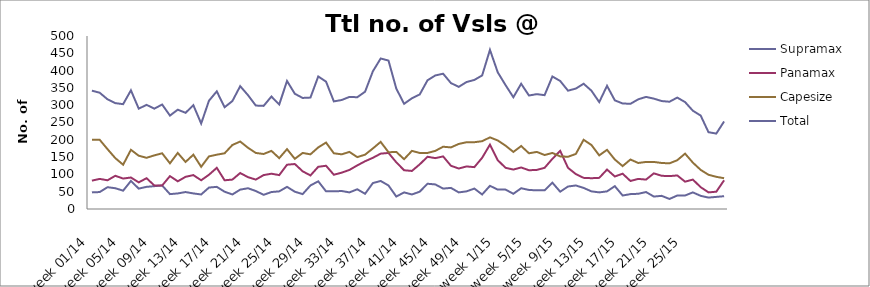
| Category | Supramax | Panamax | Capesize | Total |
|---|---|---|---|---|
| week 01/14 | 48 | 82 | 200 | 342 |
| week 02/14 | 49 | 87 | 200 | 336 |
| week 03/14 | 63 | 83 | 173 | 317 |
| week 04/14 | 60 | 96 | 147 | 306 |
| week 05/14 | 53 | 88 | 128 | 303 |
| week 06/14 | 81 | 91 | 171 | 343 |
| week 07/14 | 59 | 77 | 154 | 290 |
| week 08/14 | 64 | 89 | 148 | 301 |
| week 09/14 | 66 | 68 | 155 | 290 |
| week 10/14 | 68 | 68 | 161 | 302 |
| week 11/14 | 43 | 95 | 132 | 270 |
| week 12/14 | 45 | 80 | 162 | 287 |
| week 13/14 | 49 | 93 | 136 | 278 |
| week 14/14 | 45 | 98 | 157 | 300 |
| week 15/14 | 42 | 83 | 122 | 247 |
| week 16/14 | 62 | 99 | 152 | 313 |
| week 17/14 | 64 | 119 | 157 | 340 |
| week 18/14 | 50 | 83 | 161 | 294 |
| week 19/14 | 42 | 85 | 185 | 312 |
| week 20/14 | 56 | 104 | 195 | 355 |
| week 21/14 | 60 | 92 | 177 | 329 |
| week 22/14 | 52 | 85 | 162 | 299 |
| week 23/14 | 41 | 98 | 159 | 298 |
| week 24/14 | 49 | 102 | 168 | 325 |
| week 25/14 | 51 | 98 | 147 | 302 |
| week 26/14 | 64 | 128 | 173 | 370 |
| week 27/14 | 50 | 130 | 145 | 333 |
| week 28/14 | 43 | 109 | 162 | 321 |
| week 29/14 | 68 | 97 | 158 | 322 |
| week 30/14 | 80 | 122 | 178 | 383 |
| week 31/14 | 51 | 125 | 192 | 368 |
| week 32/14 | 51 | 99 | 161 | 311 |
| week 33/14 | 52 | 105 | 158 | 315 |
| week 34/14 | 48 | 113 | 165 | 324 |
| week 35/14 | 57 | 126 | 150 | 323 |
| week 36/14 | 44 | 138 | 157 | 339 |
| week 37/14 | 75 | 148 | 175 | 398 |
| week 38/14 | 81 | 160 | 194 | 435 |
| week 39/14 | 68 | 162 | 164 | 429 |
| week 40/14 | 36 | 135 | 165 | 348 |
| week 41/14 | 48 | 112 | 144 | 304 |
| week 42/14 | 42 | 110 | 168 | 320 |
| week 43/14 | 50 | 129 | 162 | 331 |
| week 44/14 | 73 | 151 | 162 | 372 |
| week 45/14 | 71 | 147 | 168 | 386 |
| week 46/14 | 59 | 152 | 180 | 391 |
| week 47/14 | 61 | 125 | 178 | 364 |
| week 48/14 | 48 | 117 | 188 | 353 |
| week 49/14 | 51 | 123 | 193 | 367 |
| week 50/14 | 59 | 121 | 193 | 373 |
| week 51/14 | 42 | 148 | 196 | 386 |
| week 52/14 | 67 | 186 | 207 | 460 |
| week 1/15 | 56 | 141 | 198 | 395 |
| week 2/15 | 56 | 119 | 183 | 358 |
| week 3/15 | 44 | 114 | 165 | 323 |
| week 4/15 | 60 | 120 | 182 | 362 |
| week 5/15 | 55 | 112 | 161 | 328 |
| week 6/15 | 54 | 113 | 165 | 332 |
| week 7/15 | 54 | 119 | 156 | 329 |
| week 8/15 | 76 | 145 | 162 | 383 |
| week 9/15 | 50 | 168 | 152 | 370 |
| week 10/15 | 65 | 119 | 151 | 342 |
| week 11/15 | 68 | 101 | 159 | 348 |
| week 12/15 | 61 | 90 | 200 | 362 |
| week 13/15 | 51 | 89 | 185 | 342 |
| week 14/15 | 48 | 90 | 155 | 309 |
| week 15/15 | 51 | 114 | 171 | 356 |
| week 16/15 | 66 | 94 | 143 | 314 |
| week 17/15 | 39 | 102 | 124 | 305 |
| week 18/15 | 43 | 81 | 143 | 304 |
| week 19/15 | 44 | 87 | 133 | 317 |
| week 20/15 | 49 | 85 | 136 | 324 |
| week 21/15 | 36 | 103 | 136 | 319 |
| week 22/15 | 38 | 96 | 133 | 312 |
| week 23/15 | 29 | 95 | 132 | 310 |
| week 24/15 | 39 | 97 | 141 | 322 |
| week 25/15 | 39 | 79 | 160 | 309 |